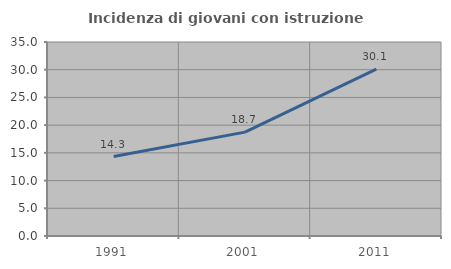
| Category | Incidenza di giovani con istruzione universitaria |
|---|---|
| 1991.0 | 14.326 |
| 2001.0 | 18.744 |
| 2011.0 | 30.108 |